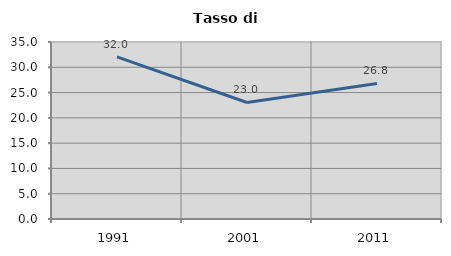
| Category | Tasso di disoccupazione   |
|---|---|
| 1991.0 | 32.049 |
| 2001.0 | 23.042 |
| 2011.0 | 26.813 |